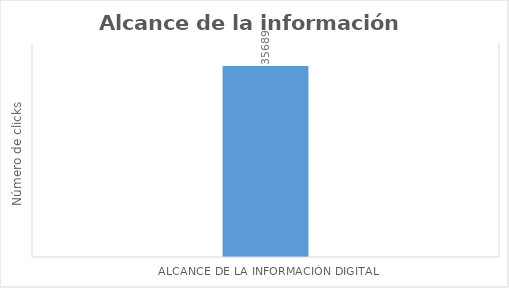
| Category | VP  |
|---|---|
| Alcance de la información digital | 35689 |